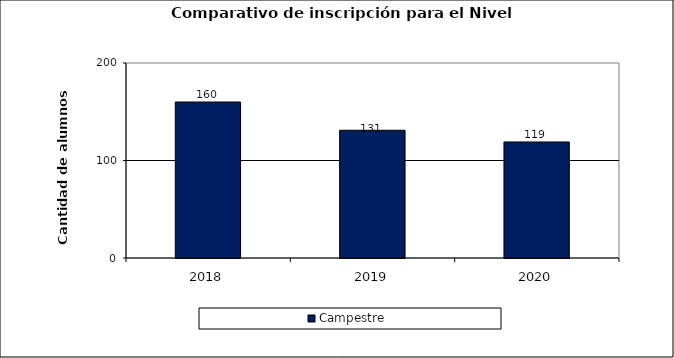
| Category | Campestre |
|---|---|
| 2018.0 | 160 |
| 2019.0 | 131 |
| 2020.0 | 119 |